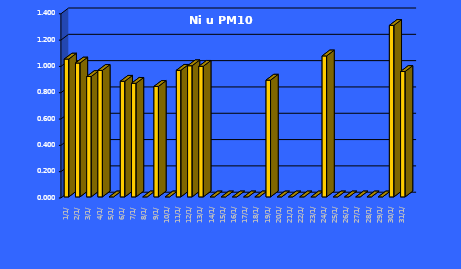
| Category | Ni u PM10 [ng/m3] |
|---|---|
| 2023-01-01 | 1.048 |
| 2023-01-02 | 1.017 |
| 2023-01-03 | 0.915 |
| 2023-01-04 | 0.962 |
| 2023-01-05 | 0 |
| 2023-01-06 | 0.879 |
| 2023-01-07 | 0.863 |
| 2023-01-08 | 0 |
| 2023-01-09 | 0.84 |
| 2023-01-10 | 0 |
| 2023-01-11 | 0.962 |
| 2023-01-12 | 0.997 |
| 2023-01-13 | 0.993 |
| 2023-01-14 | 0 |
| 2023-01-15 | 0 |
| 2023-01-16 | 0 |
| 2023-01-17 | 0 |
| 2023-01-18 | 0 |
| 2023-01-19 | 0.888 |
| 2023-01-20 | 0 |
| 2023-01-21 | 0 |
| 2023-01-22 | 0 |
| 2023-01-23 | 0 |
| 2023-01-24 | 1.072 |
| 2023-01-25 | 0 |
| 2023-01-26 | 0 |
| 2023-01-27 | 0 |
| 2023-01-28 | 0 |
| 2023-01-29 | 0 |
| 2023-01-30 | 1.304 |
| 2023-01-31 | 0.953 |